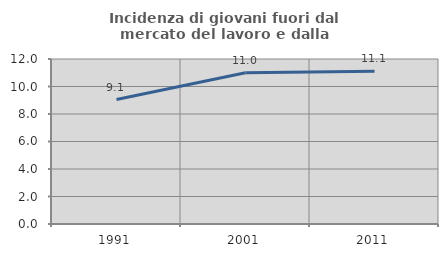
| Category | Incidenza di giovani fuori dal mercato del lavoro e dalla formazione  |
|---|---|
| 1991.0 | 9.052 |
| 2001.0 | 11.005 |
| 2011.0 | 11.111 |